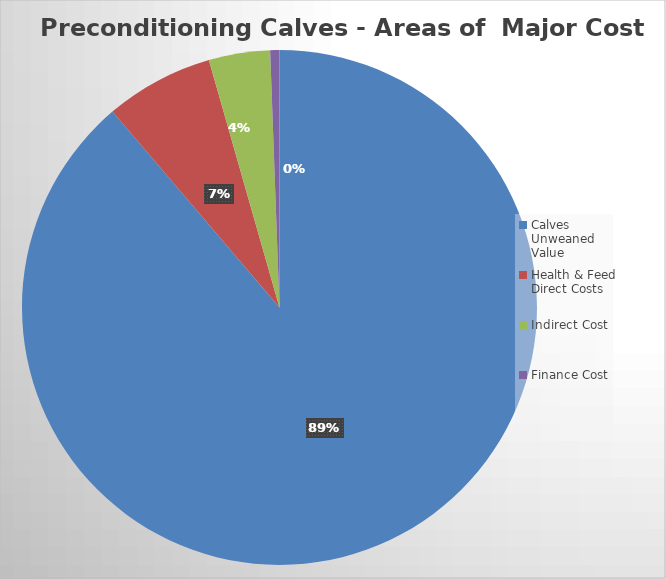
| Category | Series 0 | Series 1 |
|---|---|---|
| Calves Unweaned Value | 779.664 | 0.888 |
| Health & Feed Direct Costs | 59.85 | 0.068 |
| Indirect Cost | 33.75 | 0.038 |
| Finance Cost | 5.095 | 0.006 |